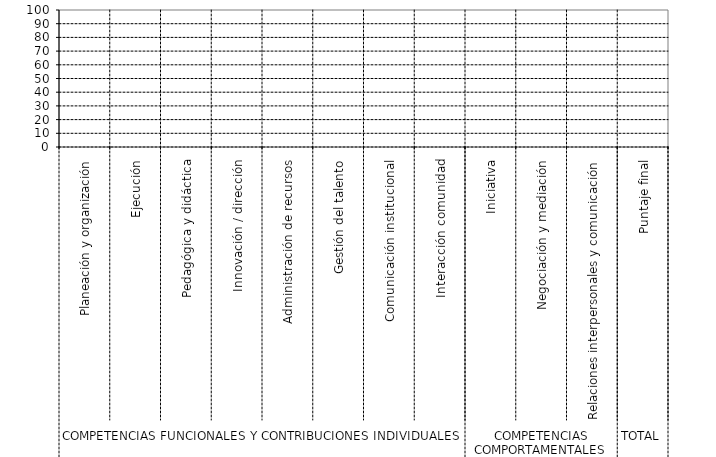
| Category | Series 0 |
|---|---|
| 0 | 0 |
| 1 | 0 |
| 2 | 0 |
| 3 | 0 |
| 4 | 0 |
| 5 | 0 |
| 6 | 0 |
| 7 | 0 |
| 8 | 0 |
| 9 | 0 |
| 10 | 0 |
| 11 | 0 |